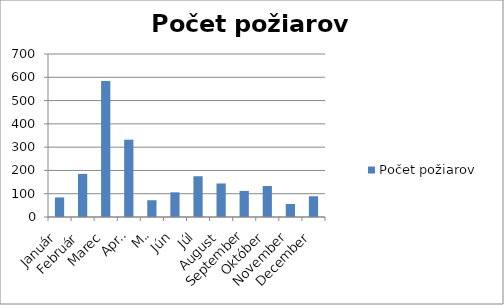
| Category | Počet požiarov   |
|---|---|
| Január | 84 |
| Február | 185 |
| Marec | 584 |
| Apríl | 332 |
| Máj | 72 |
| Jún | 106 |
| Júl | 175 |
| August | 144 |
| September | 112 |
| Október | 133 |
| November | 56 |
| December | 89 |